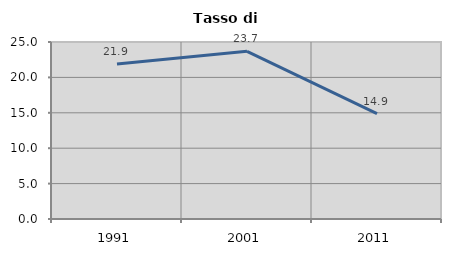
| Category | Tasso di disoccupazione   |
|---|---|
| 1991.0 | 21.906 |
| 2001.0 | 23.684 |
| 2011.0 | 14.878 |